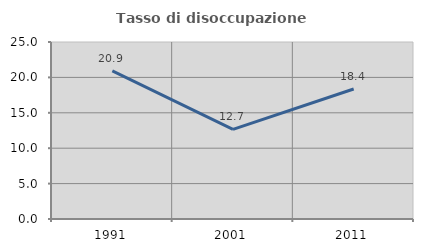
| Category | Tasso di disoccupazione giovanile  |
|---|---|
| 1991.0 | 20.926 |
| 2001.0 | 12.664 |
| 2011.0 | 18.362 |